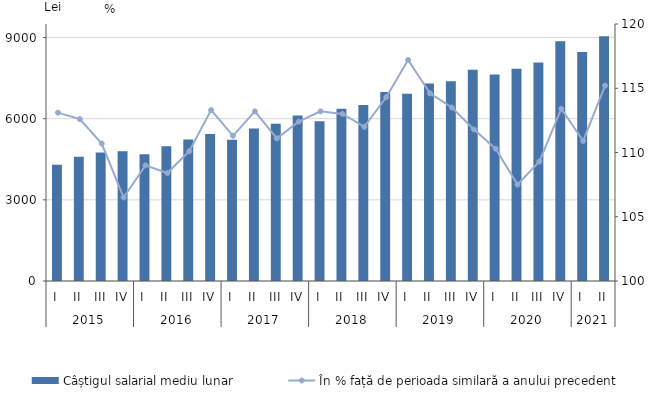
| Category | Câștigul salarial mediu lunar |
|---|---|
| 0 | 4300.2 |
| 1 | 4594.2 |
| 2 | 4749.2 |
| 3 | 4800.8 |
| 4 | 4689.2 |
| 5 | 4980.7 |
| 6 | 5229.2 |
| 7 | 5437.4 |
| 8 | 5218.9 |
| 9 | 5636.7 |
| 10 | 5809.1 |
| 11 | 6113.6 |
| 12 | 5906.5 |
| 13 | 6369.8 |
| 14 | 6507.3 |
| 15 | 6987.5 |
| 16 | 6923 |
| 17 | 7302.6 |
| 18 | 7385 |
| 19 | 7813.1 |
| 20 | 7633.9 |
| 21 | 7849 |
| 22 | 8074.3 |
| 23 | 8859.9 |
| 24 | 8468.6 |
| 25 | 9044.5 |